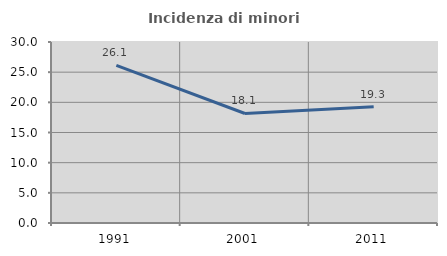
| Category | Incidenza di minori stranieri |
|---|---|
| 1991.0 | 26.126 |
| 2001.0 | 18.149 |
| 2011.0 | 19.257 |